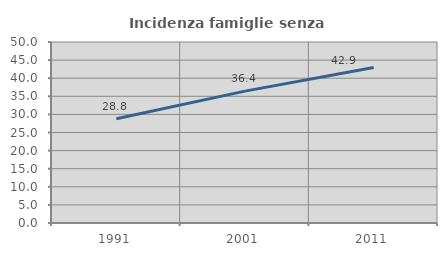
| Category | Incidenza famiglie senza nuclei |
|---|---|
| 1991.0 | 28.823 |
| 2001.0 | 36.43 |
| 2011.0 | 42.945 |